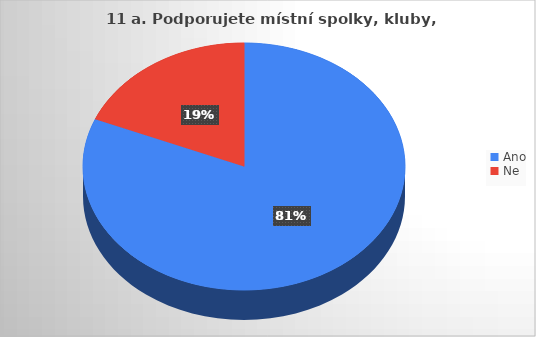
| Category | Series 0 |
|---|---|
| Ano | 13 |
| Ne | 3 |